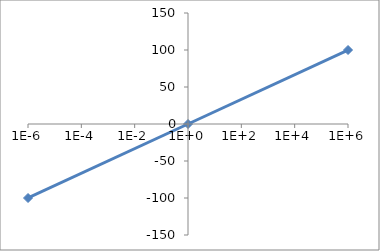
| Category | Series 1 |
|---|---|
| 1e-06 | -100 |
| 1.0 | 0 |
| 1000000.0 | 100 |